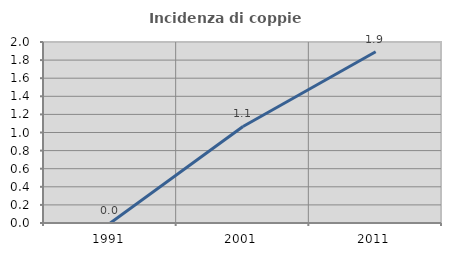
| Category | Incidenza di coppie miste |
|---|---|
| 1991.0 | 0 |
| 2001.0 | 1.067 |
| 2011.0 | 1.892 |